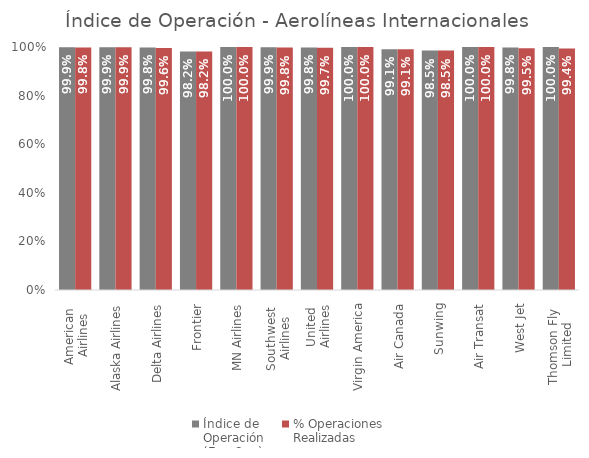
| Category | Índice de 
Operación
(Ene-Sep) | % Operaciones
Realizadas |
|---|---|---|
| American 
Airlines | 0.999 | 0.998 |
| Alaska Airlines | 0.999 | 0.999 |
| Delta Airlines | 0.998 | 0.996 |
| Frontier | 0.982 | 0.982 |
| MN Airlines | 1 | 1 |
| Southwest 
Airlines | 0.999 | 0.998 |
| United 
Airlines | 0.998 | 0.997 |
| Virgin America | 1 | 1 |
| Air Canada | 0.991 | 0.991 |
| Sunwing | 0.985 | 0.985 |
| Air Transat | 1 | 1 |
| West Jet | 0.998 | 0.995 |
| Thomson Fly 
Limited | 1 | 0.994 |